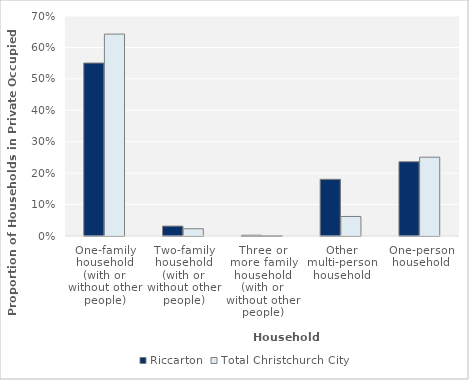
| Category | Riccarton | Total Christchurch City |
|---|---|---|
| One-family household (with or without other people) | 0.55 |  |
| Two-family household (with or without other people) | 0.031 |  |
| Three or more family household (with or without other people) | 0.002 |  |
| Other multi-person household | 0.18 |  |
| One-person household | 0.236 |  |